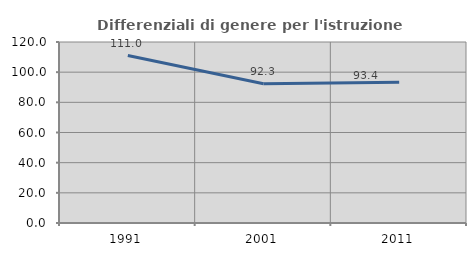
| Category | Differenziali di genere per l'istruzione superiore |
|---|---|
| 1991.0 | 111.042 |
| 2001.0 | 92.308 |
| 2011.0 | 93.383 |